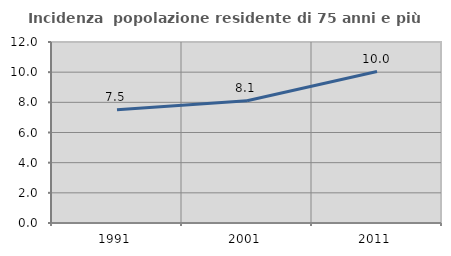
| Category | Incidenza  popolazione residente di 75 anni e più |
|---|---|
| 1991.0 | 7.514 |
| 2001.0 | 8.111 |
| 2011.0 | 10.04 |